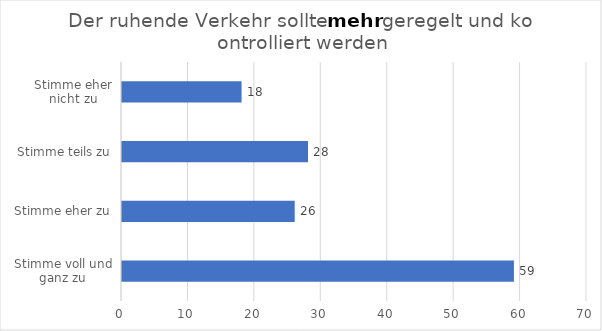
| Category | Series 0 |
|---|---|
| Stimme voll und ganz zu | 59 |
| Stimme eher zu | 26 |
| Stimme teils zu | 28 |
| Stimme eher nicht zu | 18 |